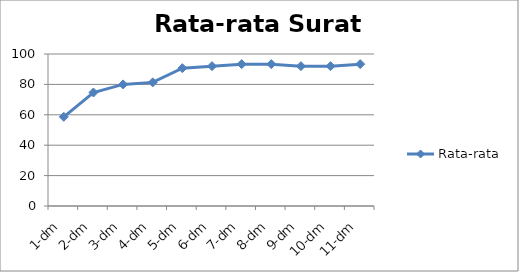
| Category | Rata-rata |
|---|---|
| 1-dm | 58.667 |
| 2-dm | 74.667 |
| 3-dm | 80 |
| 4-dm | 81.333 |
| 5-dm | 90.667 |
| 6-dm | 92 |
| 7-dm | 93.333 |
| 8-dm | 93.333 |
| 9-dm | 92 |
| 10-dm | 92 |
| 11-dm | 93.333 |